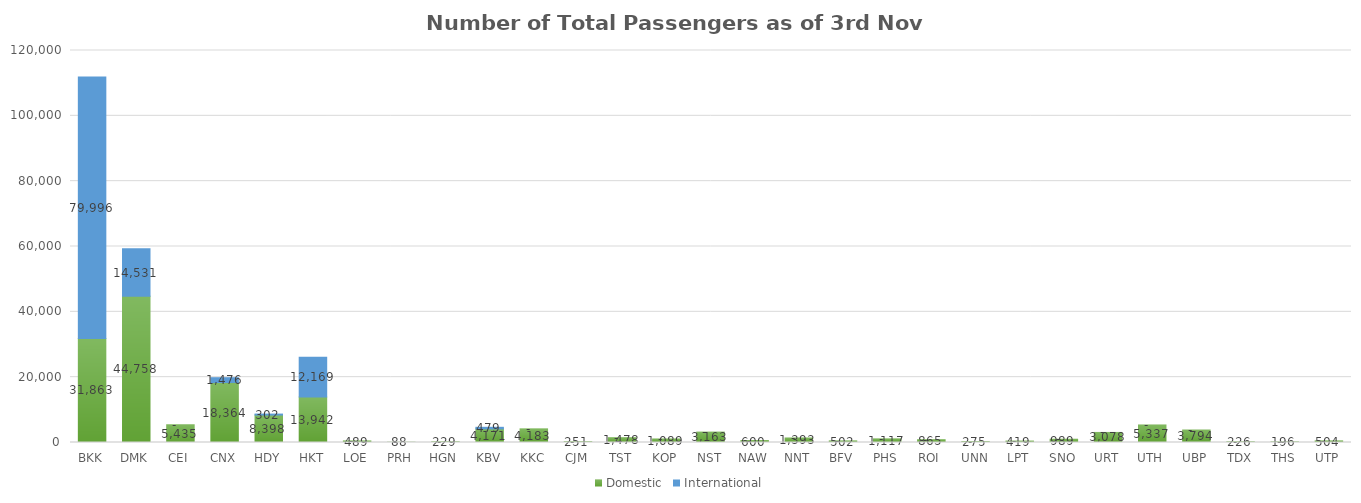
| Category | Domestic | International |
|---|---|---|
| BKK | 31863 | 79996 |
| DMK | 44758 | 14531 |
| CEI | 5435 | 0 |
| CNX | 18364 | 1476 |
| HDY | 8398 | 302 |
| HKT | 13942 | 12169 |
| LOE | 489 | 0 |
| PRH | 88 | 0 |
| HGN | 229 | 0 |
| KBV | 4171 | 479 |
| KKC | 4183 | 0 |
| CJM | 251 | 0 |
| TST | 1478 | 0 |
| KOP | 1089 | 0 |
| NST | 3163 | 0 |
| NAW | 600 | 0 |
| NNT | 1393 | 0 |
| BFV | 502 | 0 |
| PHS | 1117 | 0 |
| ROI | 865 | 0 |
| UNN | 275 | 0 |
| LPT | 419 | 0 |
| SNO | 989 | 0 |
| URT | 3078 | 0 |
| UTH | 5337 | 0 |
| UBP | 3794 | 0 |
| TDX | 226 | 0 |
| THS | 196 | 0 |
| UTP | 504 | 0 |